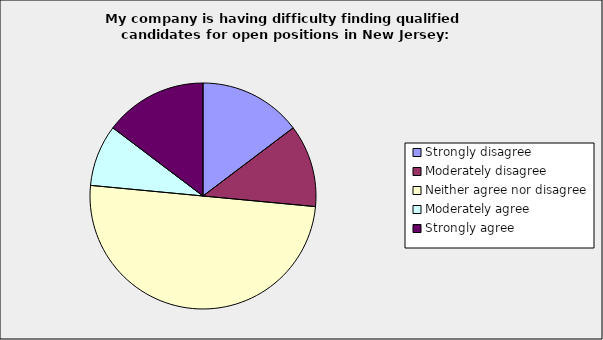
| Category | Series 0 |
|---|---|
| Strongly disagree | 0.147 |
| Moderately disagree | 0.118 |
| Neither agree nor disagree | 0.5 |
| Moderately agree | 0.088 |
| Strongly agree | 0.147 |